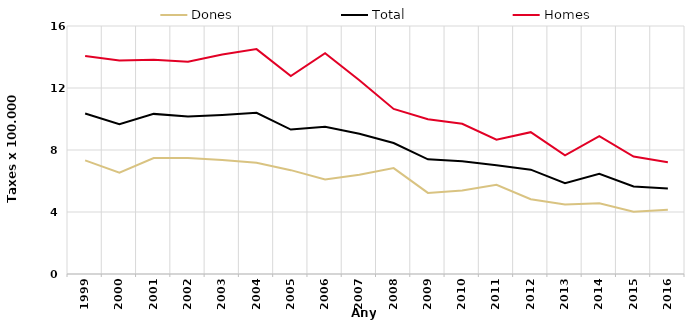
| Category | Dones | Total | Homes |
|---|---|---|---|
| 1999.0 | 7.33 | 10.35 | 14.07 |
| 2000.0 | 6.53 | 9.66 | 13.77 |
| 2001.0 | 7.48 | 10.33 | 13.82 |
| 2002.0 | 7.49 | 10.16 | 13.69 |
| 2003.0 | 7.36 | 10.26 | 14.16 |
| 2004.0 | 7.17 | 10.4 | 14.51 |
| 2005.0 | 6.7 | 9.32 | 12.77 |
| 2006.0 | 6.1 | 9.5 | 14.24 |
| 2007.0 | 6.41 | 9.05 | 12.5 |
| 2008.0 | 6.83 | 8.45 | 10.65 |
| 2009.0 | 5.23 | 7.4 | 9.99 |
| 2010.0 | 5.39 | 7.28 | 9.69 |
| 2011.0 | 5.75 | 7.02 | 8.66 |
| 2012.0 | 4.82 | 6.73 | 9.15 |
| 2013.0 | 4.49 | 5.86 | 7.65 |
| 2014.0 | 4.57 | 6.47 | 8.89 |
| 2015.0 | 4.02 | 5.65 | 7.58 |
| 2016.0 | 4.14 | 5.52 | 7.21 |